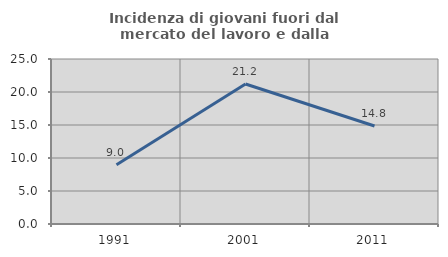
| Category | Incidenza di giovani fuori dal mercato del lavoro e dalla formazione  |
|---|---|
| 1991.0 | 8.971 |
| 2001.0 | 21.218 |
| 2011.0 | 14.842 |